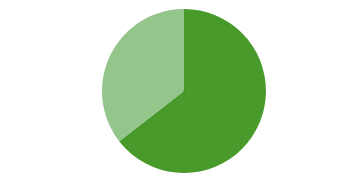
| Category | Män | Kvinnor | Series 2 |
|---|---|---|---|
| Män | 11261 | 6195 |  |